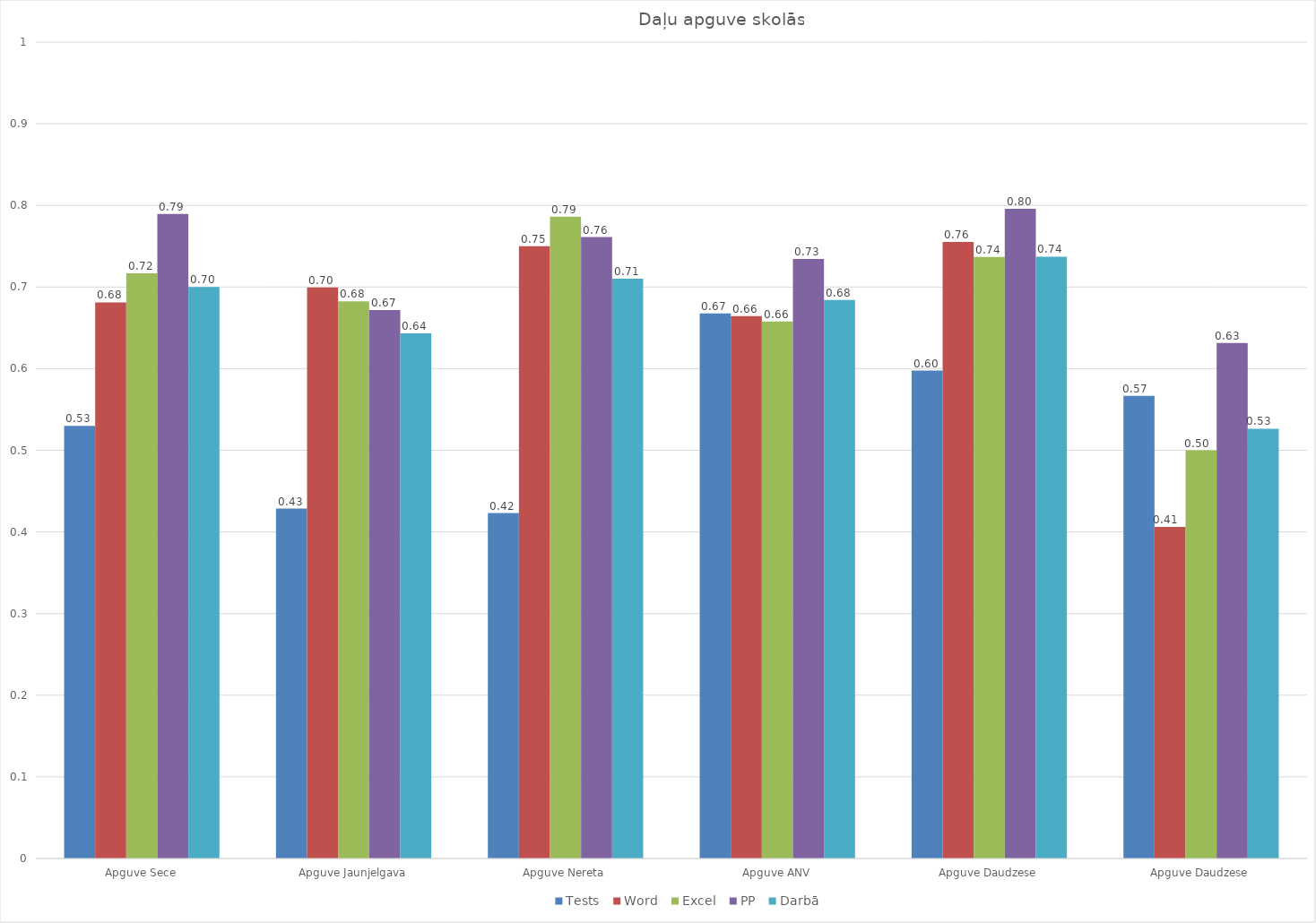
| Category | Tests | Word | Excel | PP | Darbā |
|---|---|---|---|---|---|
| Apguve Sece | 0.53 | 0.681 | 0.717 | 0.789 | 0.7 |
| Apguve Jaunjelgava | 0.429 | 0.699 | 0.683 | 0.672 | 0.643 |
| Apguve Nereta | 0.423 | 0.75 | 0.786 | 0.761 | 0.71 |
| Apguve ANV | 0.668 | 0.664 | 0.658 | 0.734 | 0.684 |
| Apguve Daudzese | 0.598 | 0.755 | 0.737 | 0.796 | 0.737 |
| Apguve Daudzese | 0.567 | 0.406 | 0.5 | 0.632 | 0.526 |